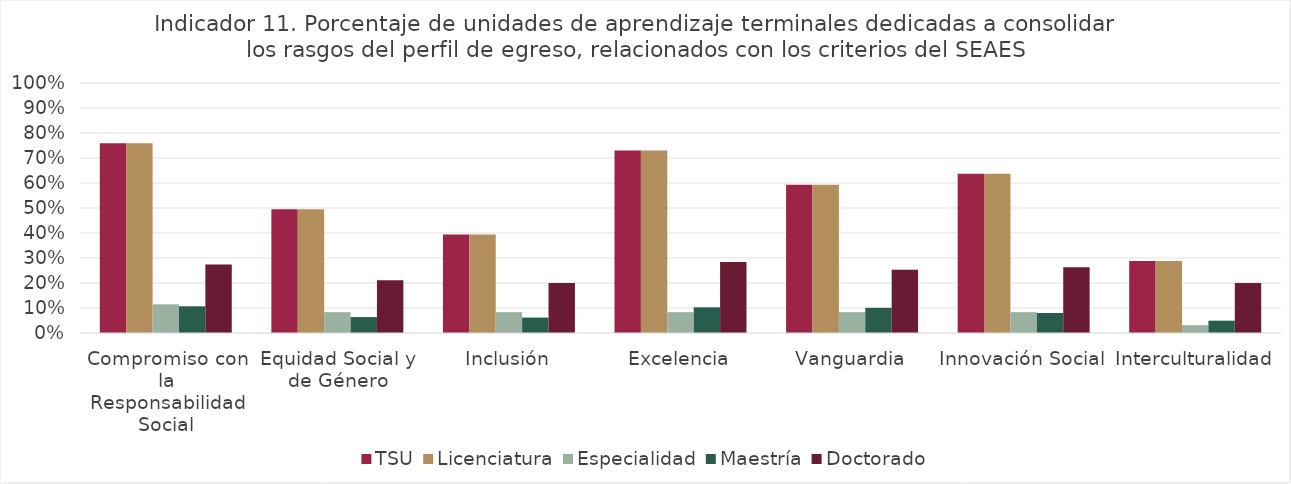
| Category | TSU | Licenciatura | Especialidad | Maestría | Doctorado |
|---|---|---|---|---|---|
| Compromiso con la Responsabilidad Social | 0.759 | 0.759 | 0.115 | 0.107 | 0.274 |
| Equidad Social y de Género | 0.495 | 0.495 | 0.083 | 0.064 | 0.211 |
| Inclusión | 0.394 | 0.394 | 0.083 | 0.062 | 0.2 |
| Excelencia | 0.73 | 0.73 | 0.083 | 0.103 | 0.284 |
| Vanguardia | 0.593 | 0.593 | 0.083 | 0.101 | 0.253 |
| Innovación Social | 0.637 | 0.637 | 0.083 | 0.08 | 0.263 |
| Interculturalidad | 0.288 | 0.288 | 0.031 | 0.049 | 0.2 |